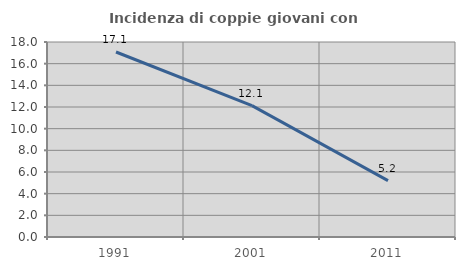
| Category | Incidenza di coppie giovani con figli |
|---|---|
| 1991.0 | 17.078 |
| 2001.0 | 12.132 |
| 2011.0 | 5.203 |